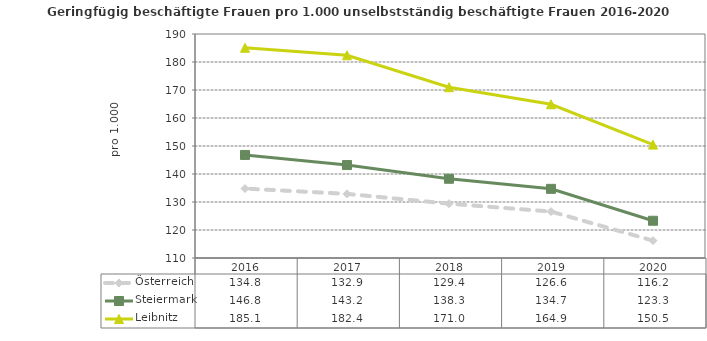
| Category | Österreich | Steiermark | Leibnitz |
|---|---|---|---|
| 2020.0 | 116.2 | 123.3 | 150.5 |
| 2019.0 | 126.6 | 134.7 | 164.9 |
| 2018.0 | 129.4 | 138.3 | 171 |
| 2017.0 | 132.9 | 143.2 | 182.4 |
| 2016.0 | 134.8 | 146.8 | 185.1 |